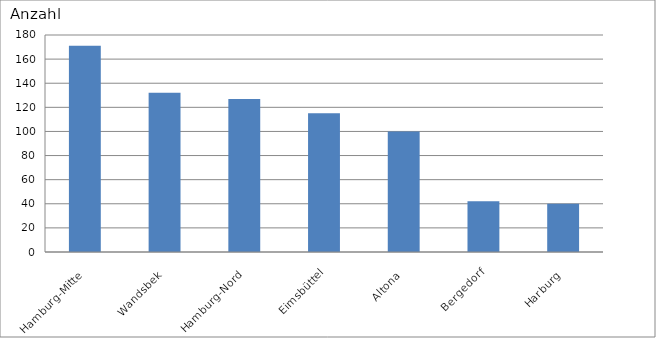
| Category | Hamburg-Mitte |
|---|---|
| Hamburg-Mitte | 171 |
| Wandsbek | 132 |
| Hamburg-Nord | 127 |
| Eimsbüttel | 115 |
| Altona | 100 |
| Bergedorf | 42 |
| Harburg | 40 |